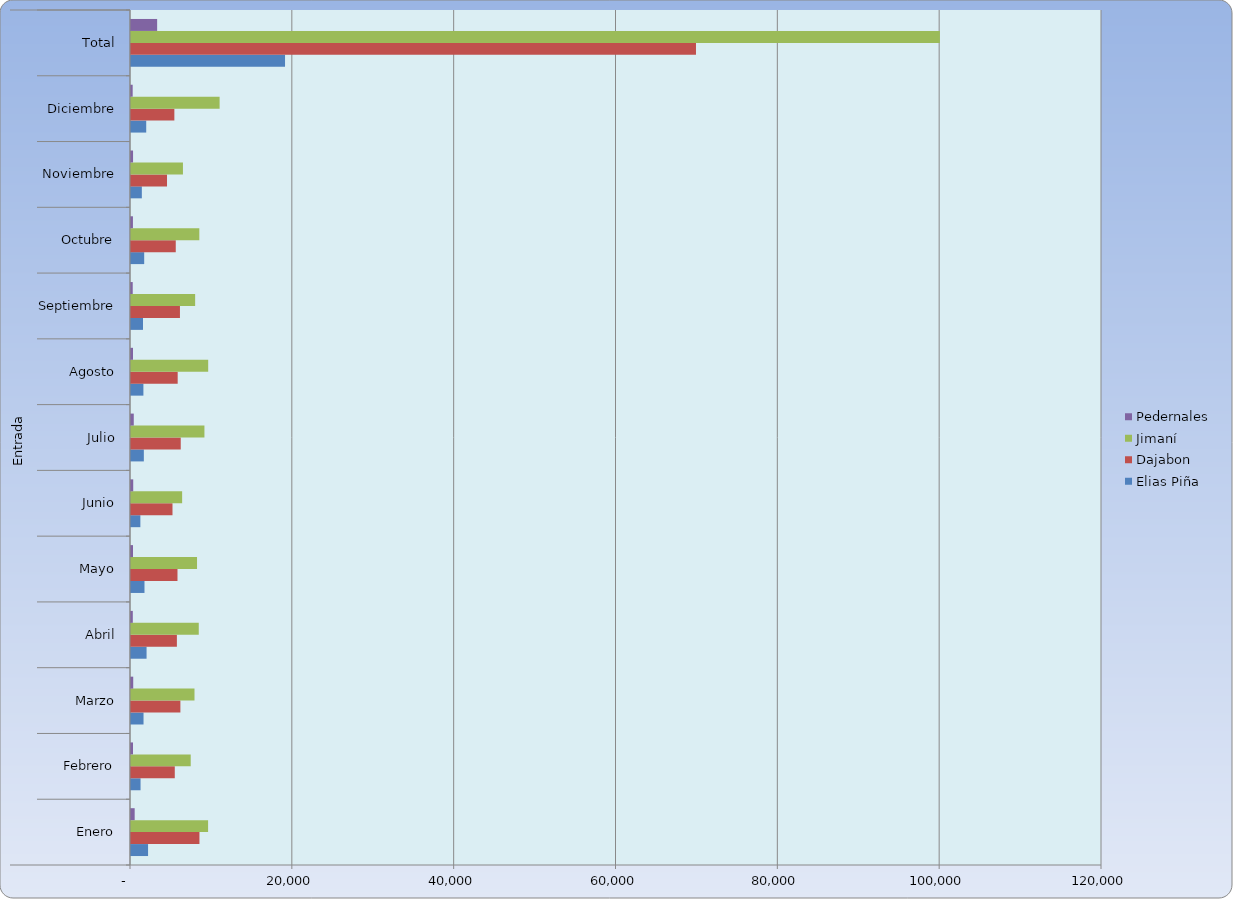
| Category | Elias Piña | Dajabon | Jimaní | Pedernales  |
|---|---|---|---|---|
| 0 | 2109 | 8459 | 9528 | 454 |
| 1 | 1181 | 5411 | 7381 | 249 |
| 2 | 1548 | 6104 | 7847 | 275 |
| 3 | 1924 | 5671 | 8374 | 223 |
| 4 | 1667 | 5745 | 8160 | 250 |
| 5 | 1157 | 5128 | 6320 | 275 |
| 6 | 1587 | 6147 | 9075 | 342 |
| 7 | 1533 | 5769 | 9540 | 251 |
| 8 | 1480 | 6049 | 7927 | 213 |
| 9 | 1630 | 5531 | 8444 | 238 |
| 10 | 1339 | 4450 | 6420 | 254 |
| 11 | 1881 | 5359 | 10951 | 207 |
| 12 | 19036 | 69823 | 99967 | 3231 |